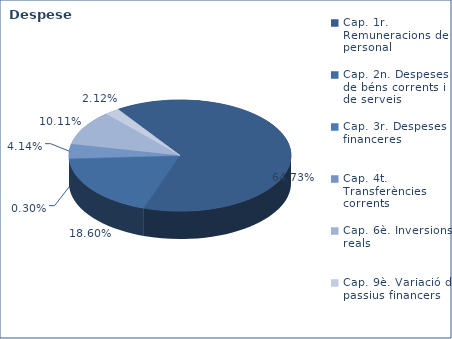
| Category | Series 0 |
|---|---|
| Cap. 1r. Remuneracions de personal | 190920340 |
| Cap. 2n. Despeses de béns corrents i de serveis | 54856074 |
| Cap. 3r. Despeses financeres | 881958 |
| Cap. 4t. Transferències corrents | 12226079 |
| Cap. 6è. Inversions reals | 29816961 |
| Cap. 9è. Variació de passius financers | 6263624 |